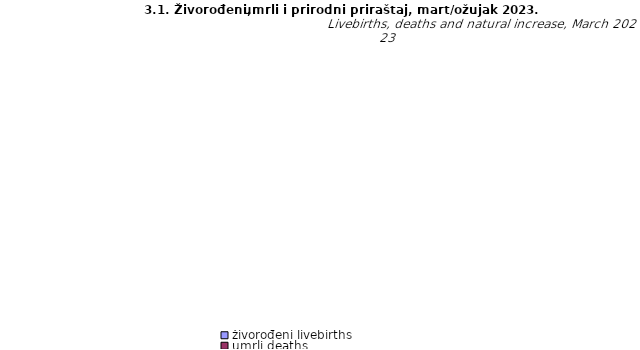
| Category | živorođeni livebirths | umrli deaths | prirodni priraštaj natural increase |
|---|---|---|---|
| Unsko - sanski | 128 | 187 | -59 |
| Kanton Posavski | 5 | 26 | -21 |
| Tuzlanski | 257 | 392 | -135 |
| Zeničko - dobojski | 199 | 320 | -121 |
| Bosansko - podrinjski | 12 | 20 | -8 |
| Srednjobosanski | 131 | 210 | -79 |
| Hercegovačko-neretvanski | 116 | 211 | -95 |
| Zapadnohercegovački | 75 | 80 | -5 |
| Kanton Sarajevo | 312 | 427 | -115 |
| Kanton 10 | 25 | 65 | -40 |